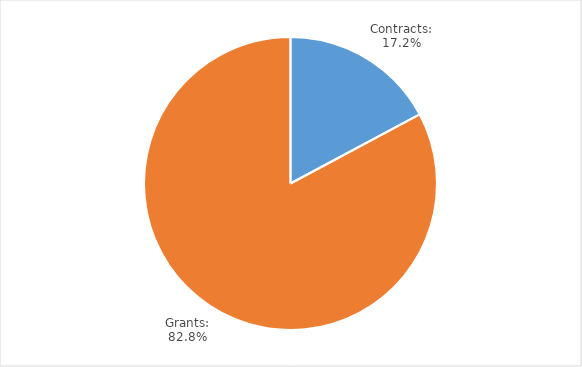
| Category | Percent |
|---|---|
| Contracts: | 0.172 |
| Grants: | 0.828 |